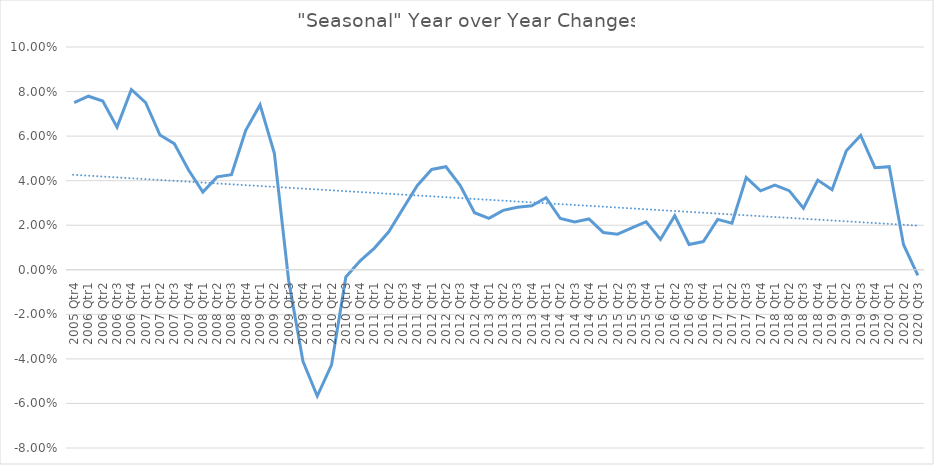
| Category | "Seasonal" Year over Year Changes |
|---|---|
| 2005 Qtr4 | 0.075 |
| 2006 Qtr1 | 0.078 |
| 2006 Qtr2 | 0.076 |
| 2006 Qtr3 | 0.064 |
| 2006 Qtr4 | 0.081 |
| 2007 Qtr1 | 0.075 |
| 2007 Qtr2 | 0.06 |
| 2007 Qtr3 | 0.057 |
| 2007 Qtr4 | 0.045 |
| 2008 Qtr1 | 0.035 |
| 2008 Qtr2 | 0.042 |
| 2008 Qtr3 | 0.043 |
| 2008 Qtr4 | 0.063 |
| 2009 Qtr1 | 0.074 |
| 2009 Qtr2 | 0.052 |
| 2009 Qtr3 | -0.005 |
| 2009 Qtr4 | -0.041 |
| 2010 Qtr1 | -0.057 |
| 2010 Qtr2 | -0.043 |
| 2010 Qtr3 | -0.003 |
| 2010 Qtr4 | 0.004 |
| 2011 Qtr1 | 0.01 |
| 2011 Qtr2 | 0.017 |
| 2011 Qtr3 | 0.028 |
| 2011 Qtr4 | 0.038 |
| 2012 Qtr1 | 0.045 |
| 2012 Qtr2 | 0.046 |
| 2012 Qtr3 | 0.038 |
| 2012 Qtr4 | 0.026 |
| 2013 Qtr1 | 0.023 |
| 2013 Qtr2 | 0.027 |
| 2013 Qtr3 | 0.028 |
| 2013 Qtr4 | 0.029 |
| 2014 Qtr1 | 0.032 |
| 2014 Qtr2 | 0.023 |
| 2014 Qtr3 | 0.021 |
| 2014 Qtr4 | 0.023 |
| 2015 Qtr1 | 0.017 |
| 2015 Qtr2 | 0.016 |
| 2015 Qtr3 | 0.019 |
| 2015 Qtr4 | 0.022 |
| 2016 Qtr1 | 0.014 |
| 2016 Qtr2 | 0.024 |
| 2016 Qtr3 | 0.011 |
| 2016 Qtr4 | 0.013 |
| 2017 Qtr1 | 0.023 |
| 2017 Qtr2 | 0.021 |
| 2017 Qtr3 | 0.041 |
| 2017 Qtr4 | 0.035 |
| 2018 Qtr1 | 0.038 |
| 2018 Qtr2 | 0.036 |
| 2018 Qtr3 | 0.028 |
| 2018 Qtr4 | 0.04 |
| 2019 Qtr1 | 0.036 |
| 2019 Qtr2 | 0.053 |
| 2019 Qtr3 | 0.06 |
| 2019 Qtr4 | 0.046 |
| 2020 Qtr1 | 0.046 |
| 2020 Qtr2 | 0.011 |
| 2020 Qtr3 | -0.002 |